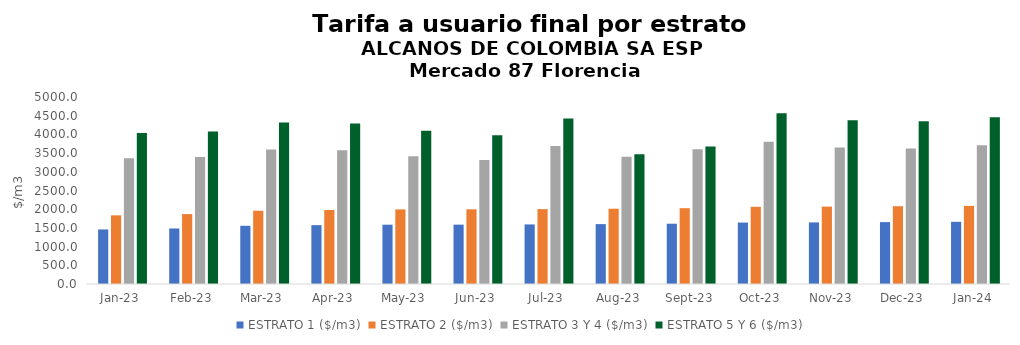
| Category | ESTRATO 1 ($/m3) | ESTRATO 2 ($/m3) | ESTRATO 3 Y 4 ($/m3) | ESTRATO 5 Y 6 ($/m3) |
|---|---|---|---|---|
| 2023-01-01 | 1458.78 | 1836 | 3365.49 | 4038.588 |
| 2023-02-01 | 1484.64 | 1868.8 | 3398.26 | 4077.912 |
| 2023-03-01 | 1556.75 | 1959.18 | 3596.1 | 4315.32 |
| 2023-04-01 | 1573.28 | 1979.65 | 3575.22 | 4290.264 |
| 2023-05-01 | 1585.35 | 1995.07 | 3416.65 | 4099.98 |
| 2023-06-01 | 1586.86 | 1997.09 | 3316.57 | 3979.884 |
| 2023-07-01 | 1592.9 | 2003.01 | 3689.81 | 4427.772 |
| 2023-08-01 | 1600.9 | 2012.86 | 3401.48 | 3469.51 |
| 2023-09-01 | 1612.14 | 2027.25 | 3603.59 | 3675.662 |
| 2023-10-01 | 1642.77 | 2064.53 | 3805.44 | 4566.528 |
| 2023-11-01 | 1647.01 | 2069.85 | 3648.51 | 4378.212 |
| 2023-12-01 | 1654.75 | 2079.33 | 3624.28 | 4349.136 |
| 2024-01-01 | 1662.37 | 2089.02 | 3712.73 | 4455.276 |